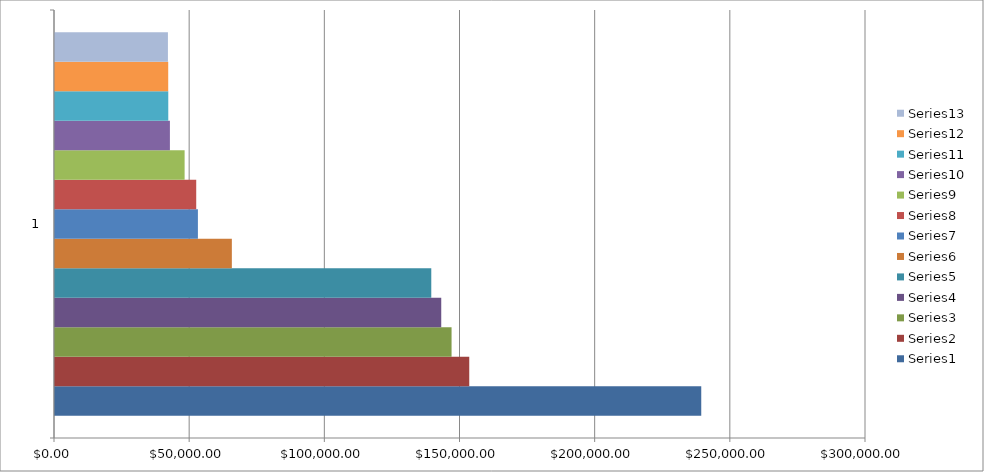
| Category | Series 0 | Series 1 | Series 2 | Series 3 | Series 4 | Series 5 | Series 6 | Series 7 | Series 8 | Series 9 | Series 10 | Series 11 | Series 12 |
|---|---|---|---|---|---|---|---|---|---|---|---|---|---|
| 0 | 239057.725 | 153240.88 | 146695.64 | 142877.595 | 139190.37 | 65418.44 | 52862.885 | 52241.28 | 47947.64 | 42505.95 | 41901.6 | 41879.76 | 41771.6 |